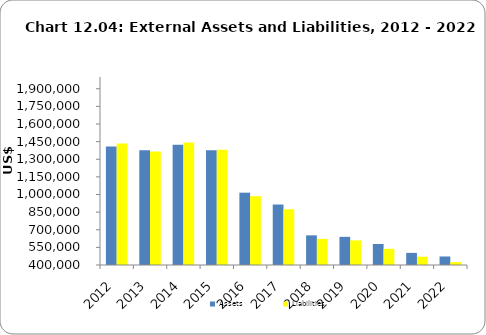
| Category | Assets | Liabilities |
|---|---|---|
| 2012.0 | 1409321 | 1434218 |
| 2013.0 | 1377200 | 1366800 |
| 2014.0 | 1423029 | 1443356 |
| 2015.0 | 1377000 | 1380000 |
| 2016.0 | 1015623 | 985470 |
| 2017.0 | 914692 | 874427 |
| 2018.0 | 652463 | 622186 |
| 2019.0 | 639524 | 609685 |
| 2020.0 | 578970 | 537752 |
| 2021.0 | 502979 | 470799 |
| 2022.0 | 472544 | 424293 |